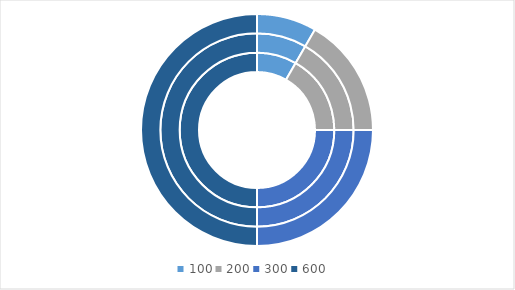
| Category | Product B | Product C | Product D |
|---|---|---|---|
| 100.0 | 100 | 100 | 100 |
| 200.0 | 200 | 200 | 200 |
| 300.0 | 300 | 300 | 300 |
| 600.0 | 600 | 600 | 600 |